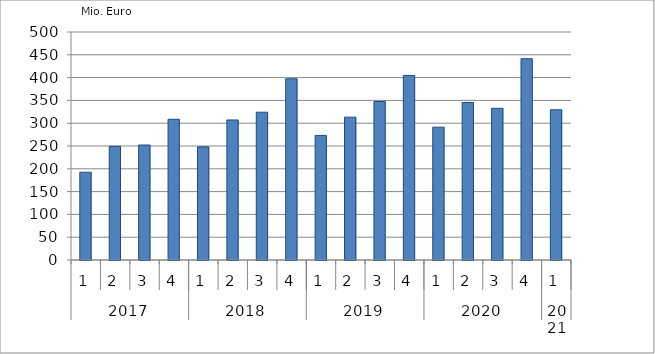
| Category | Ausbaugewerblicher Umsatz3 |
|---|---|
| 0 | 192499.539 |
| 1 | 249394.388 |
| 2 | 252146.755 |
| 3 | 308653.153 |
| 4 | 248133.418 |
| 5 | 307099.899 |
| 6 | 324088.989 |
| 7 | 397377.201 |
| 8 | 273159.137 |
| 9 | 313254.251 |
| 10 | 347631.281 |
| 11 | 404721.054 |
| 12 | 291272.144 |
| 13 | 345494.215 |
| 14 | 332629.265 |
| 15 | 441463.36 |
| 16 | 329380.212 |